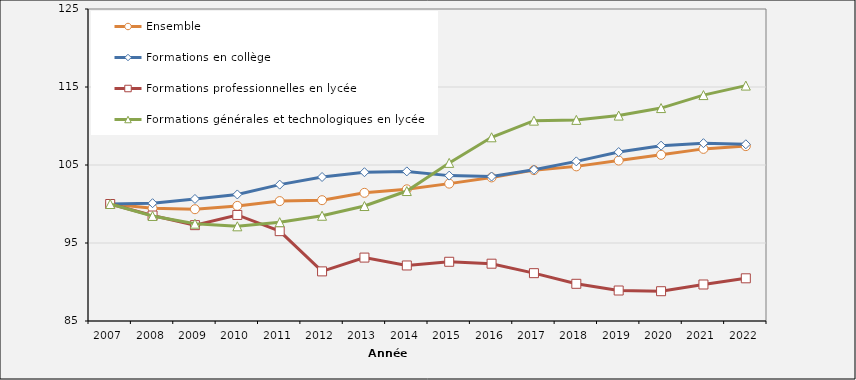
| Category | Ensemble | Formations en collège | Formations professionnelles en lycée | Formations générales et technologiques en lycée |
|---|---|---|---|---|
| 2007.0 | 100 | 100 | 100 | 100 |
| 2008.0 | 99.447 | 100.106 | 98.522 | 98.469 |
| 2009.0 | 99.332 | 100.647 | 97.288 | 97.475 |
| 2010.0 | 99.758 | 101.225 | 98.597 | 97.138 |
| 2011.0 | 100.371 | 102.482 | 96.519 | 97.668 |
| 2012.0 | 100.49 | 103.462 | 91.362 | 98.492 |
| 2013.0 | 101.431 | 104.076 | 93.131 | 99.741 |
| 2014.0 | 101.883 | 104.179 | 92.119 | 101.663 |
| 2015.0 | 102.611 | 103.639 | 92.592 | 105.27 |
| 2016.0 | 103.407 | 103.523 | 92.347 | 108.553 |
| 2017.0 | 104.341 | 104.388 | 91.134 | 110.686 |
| 2018.0 | 104.824 | 105.463 | 89.77 | 110.784 |
| 2019.0 | 105.569 | 106.659 | 88.909 | 111.335 |
| 2020.0 | 106.307 | 107.479 | 88.819 | 112.299 |
| 2021.0 | 107.067 | 107.799 | 89.68 | 113.963 |
| 2022.0 | 107.421 | 107.657 | 90.474 | 115.18 |